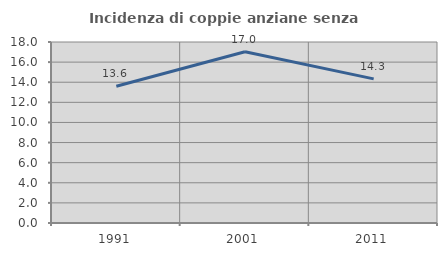
| Category | Incidenza di coppie anziane senza figli  |
|---|---|
| 1991.0 | 13.594 |
| 2001.0 | 17.037 |
| 2011.0 | 14.334 |